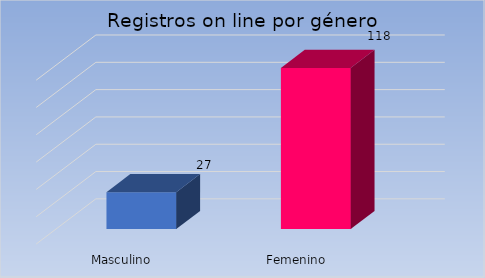
| Category | Cantidad |
|---|---|
| Masculino | 27 |
| Femenino | 118 |